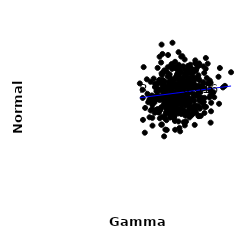
| Category | Series 0 |
|---|---|
| 69.49358248755394 | 774.494 |
| 64.76699511292031 | 627.892 |
| 52.603018426232516 | 749.544 |
| 70.51732528172685 | 779.877 |
| 66.69664657016367 | 832.307 |
| 60.18155211127949 | 646.233 |
| 63.068342344312775 | 577.009 |
| 69.70346416286793 | 740.854 |
| 56.76041487037229 | 639.082 |
| 62.64170502259871 | 674.128 |
| 62.40191790530208 | 740.859 |
| 61.19486678148184 | 726.689 |
| 64.0879669340494 | 778.202 |
| 58.8534269563528 | 654.74 |
| 67.64463074758525 | 609.296 |
| 58.26137051721574 | 718.578 |
| 62.53155760168082 | 648.875 |
| 55.27230953415532 | 707.442 |
| 68.75101402306073 | 788.634 |
| 59.067532479671186 | 744.595 |
| 57.22398082657242 | 674.608 |
| 71.03256817457375 | 734.386 |
| 62.598441838530874 | 631.546 |
| 57.26318889989209 | 643.633 |
| 66.91582814390328 | 857.381 |
| 53.02478592678378 | 727.508 |
| 60.268185577398306 | 704.56 |
| 60.23527378948172 | 628.615 |
| 60.186502487762475 | 657.765 |
| 60.91771522098261 | 697.331 |
| 76.26520944764968 | 663.845 |
| 66.29947933733365 | 753.634 |
| 58.01992256840598 | 579.779 |
| 70.12962329186105 | 891.676 |
| 65.98850461905958 | 614.426 |
| 59.2329180155086 | 541.601 |
| 71.39176050426578 | 856.465 |
| 67.44383194692223 | 552.156 |
| 57.232247153067256 | 654.455 |
| 69.2830948564099 | 687.217 |
| 60.20782470848458 | 999.563 |
| 62.99440247214117 | 573.206 |
| 71.36837369498674 | 718.231 |
| 57.158546348438854 | 692.555 |
| 61.93682959033556 | 665.877 |
| 59.69004428419732 | 613.667 |
| 70.8338760613021 | 862.778 |
| 63.61430958363045 | 738.433 |
| 63.21341989084108 | 750.719 |
| 72.51082741688326 | 551.413 |
| 65.52514043674711 | 834.441 |
| 57.50585940312715 | 663.537 |
| 56.32889291846253 | 749.045 |
| 59.0598618385409 | 733.985 |
| 51.22353071933132 | 676.805 |
| 52.97508129924943 | 734.247 |
| 57.03505263387316 | 825.522 |
| 64.42289147395755 | 683.137 |
| 74.01050849362588 | 814.492 |
| 61.14898483205432 | 729.429 |
| 65.0658281177277 | 669.674 |
| 73.01900017287157 | 735.844 |
| 57.17551099153065 | 667.926 |
| 55.583642197742215 | 499.237 |
| 51.89229761124169 | 665.543 |
| 63.55775920856428 | 830.56 |
| 68.47695772709837 | 812.123 |
| 67.28369654329474 | 691.127 |
| 68.23376926829687 | 709.698 |
| 59.93812209459671 | 612.051 |
| 67.36536270295778 | 741.121 |
| 57.320158216996425 | 562.684 |
| 67.87170142776974 | 714.434 |
| 61.35454917098179 | 466.673 |
| 60.68889534946395 | 700.037 |
| 60.38639925083026 | 669.985 |
| 65.43593987110333 | 631.91 |
| 69.7022895810603 | 643.774 |
| 52.39359806219982 | 633.641 |
| 56.790559024853366 | 644.787 |
| 50.43348416714503 | 654.773 |
| 69.274877403818 | 832.536 |
| 57.37071736883405 | 700.417 |
| 56.29438993713427 | 667.228 |
| 58.13173211590287 | 849.463 |
| 56.263271373553344 | 657.965 |
| 76.22146060209455 | 747.171 |
| 56.54958840904081 | 619.642 |
| 60.10730006867517 | 677.282 |
| 64.17031141509135 | 818.721 |
| 47.211571303268 | 711.397 |
| 68.14197198850799 | 740.291 |
| 65.88942063584331 | 653.709 |
| 76.80415070637973 | 754.305 |
| 58.14244939076543 | 729.745 |
| 73.67596551785225 | 757.984 |
| 60.31898997635111 | 703.245 |
| 64.29364032153386 | 658.937 |
| 61.82731979650754 | 649.112 |
| 64.69689720981839 | 644.377 |
| 52.25561100079566 | 669.954 |
| 62.59120270849557 | 749.416 |
| 48.1736418623023 | 448.77 |
| 67.3179325041437 | 755.817 |
| 64.67514910644891 | 781.876 |
| 61.054658649273335 | 772.189 |
| 69.2651809939701 | 817.153 |
| 64.75096588772445 | 653.509 |
| 60.61060860041507 | 691.69 |
| 51.513058806470966 | 491.987 |
| 63.1804174304224 | 800.377 |
| 66.74647452027925 | 636.303 |
| 77.5666513865694 | 689.779 |
| 64.84733595057558 | 855.255 |
| 68.9973846429724 | 791.736 |
| 57.82501592044145 | 819.547 |
| 50.70291679207265 | 584.841 |
| 65.35495784171488 | 686.007 |
| 57.09516160821062 | 655.153 |
| 53.30177742397451 | 673.947 |
| 59.7048704175574 | 737.296 |
| 71.73517358190207 | 550.042 |
| 56.55410718291843 | 734.275 |
| 61.1316650297856 | 556.562 |
| 66.63953525854993 | 789.173 |
| 70.07156002977432 | 675.672 |
| 64.78549492934806 | 762.114 |
| 74.64810357543679 | 839.773 |
| 57.56700820489637 | 525.405 |
| 59.37568859704976 | 612.782 |
| 63.23559055935486 | 477.639 |
| 65.37628449825908 | 711.702 |
| 55.57701855207658 | 667.912 |
| 73.82502819770974 | 637.304 |
| 63.17549288645596 | 583.617 |
| 71.72908586471476 | 607.273 |
| 60.57232933125699 | 691.306 |
| 64.06537787540015 | 751.661 |
| 66.67894944977229 | 747.216 |
| 66.9862596088751 | 696.586 |
| 66.51731684139581 | 677.868 |
| 61.33460118175753 | 882.705 |
| 63.489241772788056 | 623.583 |
| 68.69391918595227 | 603.983 |
| 64.42469688425065 | 661.585 |
| 59.50632626996428 | 736.321 |
| 66.09824481048328 | 817.4 |
| 60.326279476896985 | 773.498 |
| 53.46062849380199 | 656.526 |
| 55.33193055493119 | 497.551 |
| 59.30585085695639 | 733.077 |
| 54.893177374505946 | 586.655 |
| 51.05029697228569 | 667.16 |
| 64.41812417412402 | 675.271 |
| 58.98880996302943 | 567.929 |
| 62.40654622408133 | 810.687 |
| 68.94189563570723 | 653.032 |
| 47.679159466994705 | 850.383 |
| 67.65337789775928 | 731.298 |
| 70.3503309460612 | 782.763 |
| 49.3245829297732 | 686.715 |
| 67.80304335086285 | 776.412 |
| 61.94324723525865 | 586.604 |
| 67.3783490134824 | 644.011 |
| 58.69985078788327 | 760.35 |
| 50.23050792238049 | 543.132 |
| 59.573398375013646 | 587.637 |
| 78.02571941476036 | 696.71 |
| 53.78326182559855 | 574.746 |
| 83.01056409621495 | 735.577 |
| 74.26626194275237 | 605.448 |
| 64.91987268309333 | 724.469 |
| 64.35143329771802 | 674.062 |
| 58.2146199144977 | 636.12 |
| 70.50621423525405 | 570.348 |
| 68.90192210026781 | 725.945 |
| 55.676015254819106 | 802.673 |
| 60.33236537016568 | 721.067 |
| 65.38754231969897 | 790.513 |
| 61.378863412526364 | 672.364 |
| 63.53744307174237 | 457.082 |
| 62.84481024789186 | 941.723 |
| 47.385449767156985 | 527.344 |
| 67.9101753837529 | 864.962 |
| 66.13242996368643 | 662.084 |
| 61.065048965197334 | 746.066 |
| 55.97443418525756 | 721.818 |
| 60.822418919008165 | 752.023 |
| 67.67761302234965 | 783.203 |
| 64.71096384736845 | 681.542 |
| 59.3885933008424 | 665.741 |
| 54.31242082409878 | 571.975 |
| 56.47334838147151 | 696.818 |
| 52.200090702064266 | 662.382 |
| 57.55608461234536 | 720.726 |
| 56.89089692834996 | 537.299 |
| 57.88706239052546 | 589.042 |
| 66.08124232572906 | 567.602 |
| 69.3976145608881 | 675.074 |
| 71.9175318122784 | 862.497 |
| 65.54849388167796 | 571.774 |
| 57.82892832325036 | 587.584 |
| 66.67938914067211 | 817.516 |
| 59.88693603659753 | 760.985 |
| 53.22090638664756 | 702.401 |
| 54.602599983688805 | 648.697 |
| 60.13517028101922 | 867.416 |
| 52.45393309791571 | 570.827 |
| 65.50265235451353 | 897.256 |
| 62.15621291831827 | 584.898 |
| 49.65374790399704 | 634.957 |
| 65.17616926044238 | 565.057 |
| 62.04365870914429 | 837.575 |
| 59.26356611452164 | 765.606 |
| 63.50210895315618 | 742.831 |
| 74.12394031486122 | 721.386 |
| 52.029846169200134 | 780.012 |
| 65.0704306352038 | 734.544 |
| 59.527557305518286 | 648.618 |
| 59.22418491228444 | 735.517 |
| 51.44836980100818 | 539.553 |
| 61.068894208243385 | 845.991 |
| 63.412841660555436 | 652.393 |
| 62.11124145581998 | 780.476 |
| 65.57798647715107 | 493.667 |
| 71.83427226275877 | 872.79 |
| 64.47293580113964 | 692 |
| 57.10723835106126 | 467.844 |
| 66.10604953836021 | 516.821 |
| 63.30000684999981 | 675.409 |
| 62.165344565171765 | 631.024 |
| 53.68107733191756 | 593.53 |
| 56.97655650158457 | 678.663 |
| 65.97342384483143 | 748.485 |
| 60.608487540267745 | 574.97 |
| 59.60295777390157 | 860.765 |
| 55.21094594869657 | 603.823 |
| 56.632832619156545 | 740.843 |
| 75.5927819797875 | 751.364 |
| 68.64754005871809 | 727.513 |
| 58.86209255732693 | 747.278 |
| 67.87697630230431 | 755.013 |
| 53.745031362727374 | 845.44 |
| 56.6869445161198 | 652.225 |
| 56.62751790210422 | 632.931 |
| 55.96865678028687 | 736.594 |
| 54.65916855876406 | 773.116 |
| 59.297071683125914 | 556.603 |
| 50.70588632545247 | 760.28 |
| 47.28007225036011 | 661.502 |
| 65.52803452130004 | 767.455 |
| 61.03466325842516 | 549.651 |
| 55.47528358331813 | 988.175 |
| 57.93095037771403 | 615.738 |
| 73.9179809998531 | 613.869 |
| 62.818437764669625 | 517.534 |
| 55.84945265921291 | 930.803 |
| 67.61403688371452 | 542.414 |
| 71.56697791170103 | 716.353 |
| 65.06933751612875 | 700.357 |
| 77.03559478934682 | 631.881 |
| 72.00411662692962 | 768.099 |
| 58.282476416715255 | 924.513 |
| 61.20801051190661 | 778.839 |
| 54.44545579694787 | 714.059 |
| 61.801250269370136 | 722.913 |
| 62.180002567585476 | 797.989 |
| 65.15008920148671 | 708.578 |
| 64.3915960141754 | 713.062 |
| 67.87065151245432 | 812.34 |
| 64.14141429170901 | 695.603 |
| 59.79786221459141 | 868.714 |
| 54.60340770802762 | 913.936 |
| 67.32273607695768 | 629.062 |
| 70.55872902875934 | 838.375 |
| 58.67904032348741 | 664.585 |
| 64.56870459020935 | 772.339 |
| 71.4855552380595 | 800.776 |
| 66.99597350435299 | 575.545 |
| 74.79087368594254 | 606.787 |
| 56.35263620346445 | 691.156 |
| 56.02540850373039 | 666.959 |
| 65.02415400550527 | 679.121 |
| 72.07492492557328 | 730.606 |
| 58.996443278940184 | 805.703 |
| 61.664454443122054 | 602.156 |
| 63.664355332106126 | 689.497 |
| 63.21973740291596 | 850.166 |
| 58.98770869471866 | 788.646 |
| 55.43708134526838 | 749.837 |
| 51.46288103295247 | 618.559 |
| 57.15983802444133 | 729.533 |
| 69.52152357658278 | 750.031 |
| 60.76937309755114 | 677.174 |
| 63.79607255025178 | 598.592 |
| 62.102831215507415 | 732.555 |
| 64.26890201338776 | 641.086 |
| 54.499655265829674 | 661.474 |
| 75.524636586155 | 871.347 |
| 53.40507751338322 | 654.519 |
| 60.025898404558916 | 839.613 |
| 65.4466448601699 | 803.46 |
| 63.35518559607556 | 728.291 |
| 61.02576560660032 | 618.157 |
| 51.289393895130466 | 591.699 |
| 72.1178090044376 | 595.946 |
| 72.3646958214691 | 697.039 |
| 80.4590507032627 | 625.777 |
| 71.85713326618561 | 669.551 |
| 70.20364724999246 | 594.039 |
| 66.19088337294784 | 640.585 |
| 63.63893166060309 | 648.5 |
| 61.90341251442998 | 851.169 |
| 59.590060221236236 | 710.1 |
| 52.576230485950944 | 728.089 |
| 52.94228893366811 | 743.419 |
| 65.2287619088314 | 742.616 |
| 67.83463926631588 | 551.183 |
| 82.15292557132761 | 725.84 |
| 57.321989536380144 | 612.441 |
| 53.749483949818 | 704.463 |
| 67.21045986161862 | 662.149 |
| 62.71597373580672 | 583.002 |
| 60.41785837100064 | 661.183 |
| 58.44773493839169 | 722.885 |
| 64.53362213441079 | 664.516 |
| 52.737169457216396 | 587.468 |
| 71.46610350448098 | 550.668 |
| 66.63167697873142 | 665.184 |
| 66.50886127106521 | 732.93 |
| 64.48149805650057 | 917.451 |
| 76.97125486127928 | 579.844 |
| 46.01311981311852 | 750.519 |
| 62.123978700929186 | 673.134 |
| 59.280010014039775 | 544.928 |
| 59.49220011161723 | 683.617 |
| 61.02542917833643 | 533.754 |
| 78.36483201136019 | 665.896 |
| 75.14326176907971 | 783.719 |
| 61.421652128106516 | 594.925 |
| 59.4680306762403 | 619.169 |
| 59.173769896060364 | 719.866 |
| 57.20241127764124 | 631.341 |
| 71.10319893313668 | 613.549 |
| 49.05936860629611 | 775.591 |
| 69.31187134588956 | 569.899 |
| 76.65785355889517 | 677.051 |
| 59.954455056800086 | 558.564 |
| 64.00519669019617 | 563.24 |
| 55.80375370915062 | 707.722 |
| 60.058428897691286 | 665.396 |
| 60.951436194461145 | 692.565 |
| 60.91870092642041 | 771.771 |
| 58.035293717697 | 623.327 |
| 72.96026653296394 | 663.21 |
| 67.9115000744088 | 632.449 |
| 57.71861920438388 | 591.912 |
| 61.88232494641078 | 649.038 |
| 61.78661651469948 | 732.309 |
| 59.46334127367586 | 708.554 |
| 63.48710077465354 | 772.433 |
| 69.99678085014719 | 776.419 |
| 61.2699911314383 | 520.594 |
| 55.953699876410866 | 610.292 |
| 66.93772183686055 | 643.75 |
| 69.1008590226246 | 602.192 |
| 57.38938956994439 | 573.751 |
| 63.05892823095082 | 660.94 |
| 56.260976899418736 | 705.351 |
| 65.95394230918663 | 651.338 |
| 63.52000974747007 | 818.416 |
| 74.71311928418245 | 906.047 |
| 66.05853765532088 | 576.719 |
| 60.486148569271435 | 655.163 |
| 76.4367987863396 | 714.266 |
| 59.43785087991432 | 746.308 |
| 62.35373492551786 | 727.886 |
| 67.86627734565471 | 702.676 |
| 69.83257446198962 | 615.983 |
| 57.88906812950588 | 680.2 |
| 68.59575207754416 | 839.719 |
| 62.904400149880566 | 773.679 |
| 62.67804177385776 | 718.041 |
| 68.75989801394587 | 562.331 |
| 58.05407640832582 | 794.064 |
| 62.24681584165228 | 806.154 |
| 73.54999837541506 | 720.993 |
| 56.62571615808725 | 830.224 |
| 68.31197029058649 | 842.209 |
| 80.81904230657726 | 844.773 |
| 71.21216837531134 | 690.453 |
| 59.26696340171459 | 781.618 |
| 61.89554462307052 | 740.002 |
| 68.1702891043866 | 823.323 |
| 65.86910077451158 | 646.768 |
| 68.73458770537269 | 653.817 |
| 67.22661363943305 | 717.624 |
| 51.40046948215607 | 635.865 |
| 55.45469829739233 | 811.713 |
| 67.52976021261904 | 596.286 |
| 68.24098817160008 | 747.702 |
| 76.43984481335062 | 768.339 |
| 60.819315160277796 | 640.838 |
| 76.78745532788014 | 705.535 |
| 62.91182414776138 | 709.829 |
| 67.81170411986182 | 723.819 |
| 69.87410261112731 | 496.585 |
| 66.12274974273265 | 682.084 |
| 64.42730505352915 | 678.617 |
| 61.78675492028942 | 792.385 |
| 56.520717451358635 | 748.339 |
| 64.40271847878915 | 619.136 |
| 55.80866534485281 | 547.179 |
| 59.738840473036525 | 748.99 |
| 65.64138413411601 | 692.09 |
| 73.0821122519621 | 637 |
| 65.12330034895017 | 687.709 |
| 69.89404198075995 | 724.995 |
| 73.0924214452343 | 731.806 |
| 61.47775993436442 | 851.081 |
| 70.36103916806906 | 675.662 |
| 50.12482674677649 | 650.772 |
| 63.03962831171114 | 713.472 |
| 65.91313028311461 | 663.265 |
| 55.965455489711026 | 815.863 |
| 57.71707703186078 | 465.59 |
| 53.98413374632333 | 751.727 |
| 65.8343619268006 | 552.696 |
| 67.359358709003 | 847.965 |
| 68.33882407239615 | 596.975 |
| 62.954284129785464 | 864.616 |
| 58.80268550614804 | 589.289 |
| 74.10143986303564 | 569.434 |
| 60.50967915527849 | 698.469 |
| 74.18219715588236 | 662.487 |
| 64.05371779429089 | 711.213 |
| 65.11167770461148 | 513.431 |
| 62.06097544684106 | 679.798 |
| 61.24916377947021 | 625.459 |
| 62.21092630846887 | 596.245 |
| 70.42281233117278 | 828.762 |
| 62.680736437994064 | 566.411 |
| 71.83890456292161 | 646.103 |
| 61.79512673841897 | 627.256 |
| 55.16042345264101 | 595.264 |
| 69.40197168769538 | 579.893 |
| 68.85354961669387 | 734.505 |
| 67.21015347122457 | 559.954 |
| 59.677303772843835 | 635.887 |
| 54.20957331702717 | 676.062 |
| 55.77732770301127 | 655.631 |
| 63.32020033114905 | 723.488 |
| 48.31917689715184 | 600.447 |
| 64.81255853177254 | 590.96 |
| 80.21672975570695 | 791.168 |
| 56.928277917266506 | 661.677 |
| 71.78609752252748 | 663.165 |
| 61.463421701827976 | 746.317 |
| 60.91831309874466 | 646.839 |
| 66.96001011414029 | 632.759 |
| 64.02535552139912 | 914.545 |
| 55.90249327689031 | 772.681 |
| 59.59108942557693 | 691.481 |
| 59.879279665112264 | 727.042 |
| 63.603800458089914 | 676.181 |
| 55.26471561915197 | 878.477 |
| 85.68391760323446 | 818.919 |
| 65.26955754219121 | 702.795 |
| 65.86342221612031 | 727.18 |
| 58.98157782070896 | 684.813 |
| 58.12392572160879 | 680.591 |
| 72.69046330991851 | 637.253 |
| 62.42145776891832 | 847.726 |
| 73.66802569585532 | 854.633 |
| 65.08377042839113 | 641.726 |
| 66.47786330772551 | 807.459 |
| 57.70319310947877 | 601.382 |
| 64.20038388801949 | 763.098 |
| 61.55326879294056 | 610.153 |
| 67.71343512760423 | 757.067 |
| 54.3966402202931 | 770.009 |
| 56.85036040797057 | 762.783 |
| 56.28886146880871 | 761.235 |
| 56.34761280451143 | 764.826 |
| 65.34994538404129 | 757.994 |
| 62.4506387720215 | 622.526 |
| 71.81057430709974 | 735.871 |
| 66.37967534886472 | 765.859 |
| 65.09364751168489 | 624.595 |
| 56.57551991693632 | 426.489 |
| 68.6309696527554 | 557.275 |
| 60.66411455578313 | 598.463 |
| 71.61089314279226 | 779.385 |
| 58.66899004786188 | 722.392 |
| 54.70411271358312 | 537.163 |
| 76.8020406533724 | 510.374 |
| 66.53769256930802 | 662.621 |
| 69.88807024219373 | 585.877 |
| 70.07106683798898 | 874.468 |
| 57.2239349342884 | 672.879 |